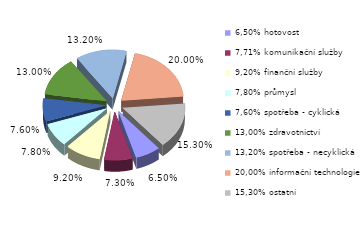
| Category | Series 0 |
|---|---|
| 6,50% hotovost | 0.065 |
| 7,71% komunikační služby | 0.073 |
| 9,20% finanční služby | 0.092 |
| 7,80% průmysl | 0.078 |
| 7,60% spotřeba - cyklická | 0.076 |
| 13,00% zdravotnictví | 0.13 |
| 13,20% spotřeba - necyklická | 0.132 |
| 20,00% informační technologie | 0.2 |
| 15,30% ostatní | 0.153 |